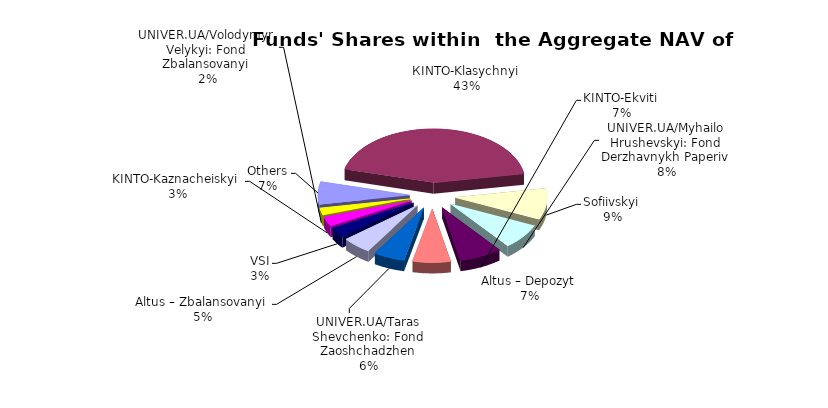
| Category | Series 0 | Series 1 |
|---|---|---|
| Others | 3743364.56 | 0.068 |
| КІNТО-Klasychnyi | 23822725.79 | 0.433 |
| Sofiivskyi | 5129248.54 | 0.093 |
| UNIVER.UA/Myhailo Hrushevskyi: Fond Derzhavnykh Paperiv | 4216040.89 | 0.077 |
| KINTO-Ekviti | 4114998.23 | 0.075 |
| Altus – Depozyt | 3667931.4 | 0.067 |
| UNIVER.UA/Taras Shevchenko: Fond Zaoshchadzhen | 3030166.18 | 0.055 |
| Altus – Zbalansovanyi | 2852408.61 | 0.052 |
| VSI | 1655317.46 | 0.03 |
| KINTO-Kaznacheiskyi | 1603254.08 | 0.029 |
| UNIVER.UA/Volodymyr Velykyi: Fond Zbalansovanyi | 1183187.29 | 0.022 |